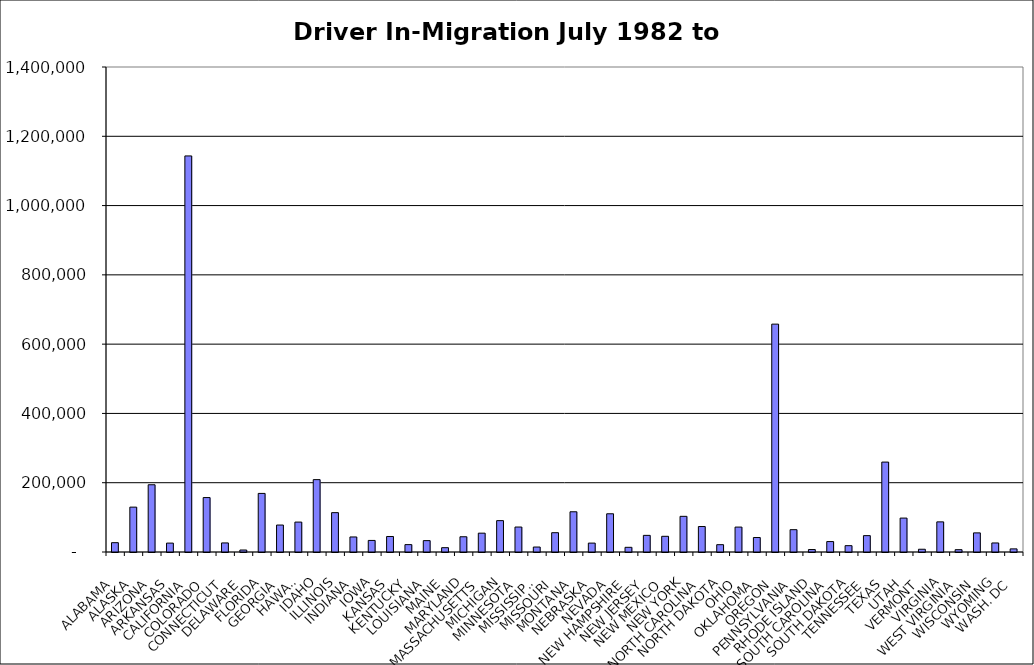
| Category | Series 0 |
|---|---|
| ALABAMA | 26904.5 |
| ALASKA | 129508.5 |
| ARIZONA | 194104 |
| ARKANSAS | 25673.5 |
| CALIFORNIA | 1143288.5 |
| COLORADO | 157122 |
| CONNECTICUT | 26161 |
| DELAWARE | 5749.5 |
| FLORIDA | 169132 |
| GEORGIA | 77821 |
| HAWAII | 86329.5 |
| IDAHO | 208881.5 |
| ILLINOIS | 113587.5 |
| INDIANA | 43404 |
| IOWA | 33396.5 |
| KANSAS | 44771.5 |
| KENTUCKY | 21291 |
| LOUISIANA | 32824.5 |
| MAINE | 12458.5 |
| MARYLAND | 44019 |
| MASSACHUSETTS | 54389 |
| MICHIGAN | 90549 |
| MINNESOTA | 72032.5 |
| MISSISSIPPI | 14339 |
| MISSOURI | 55747 |
| MONTANA | 116120 |
| NEBRASKA | 25699.5 |
| NEVADA | 110331 |
| NEW HAMPSHIRE | 13488.5 |
| NEW JERSEY | 48000 |
| NEW MEXICO | 45317 |
| NEW YORK | 102945 |
| NORTH CAROLINA | 73562.5 |
| NORTH DAKOTA | 21145.5 |
| OHIO | 71912.5 |
| OKLAHOMA | 41768 |
| OREGON | 657756 |
| PENNSYLVANIA | 64451.5 |
| RHODE ISLAND | 7116 |
| SOUTH CAROLINA | 30089.5 |
| SOUTH DAKOTA | 18288.5 |
| TENNESSEE | 47262.5 |
| TEXAS | 259554 |
| UTAH | 97900.5 |
| VERMONT | 7950 |
| VIRGINIA | 86980 |
| WEST VIRGINIA | 6718.5 |
| WISCONSIN | 55178.5 |
| WYOMING | 26096 |
| WASH. DC | 9020 |